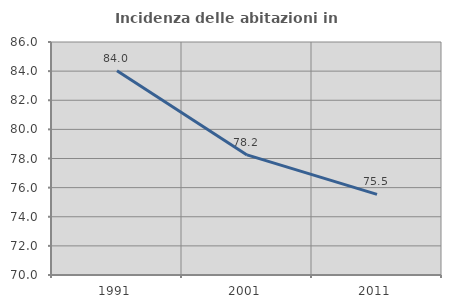
| Category | Incidenza delle abitazioni in proprietà  |
|---|---|
| 1991.0 | 84.022 |
| 2001.0 | 78.245 |
| 2011.0 | 75.538 |